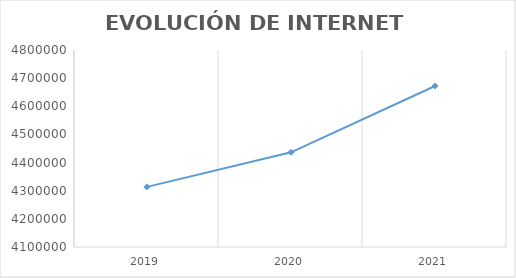
| Category | Series 0 |
|---|---|
| 2019.0 | 4313734 |
| 2020.0 | 4436390 |
| 2021.0 | 4672038 |